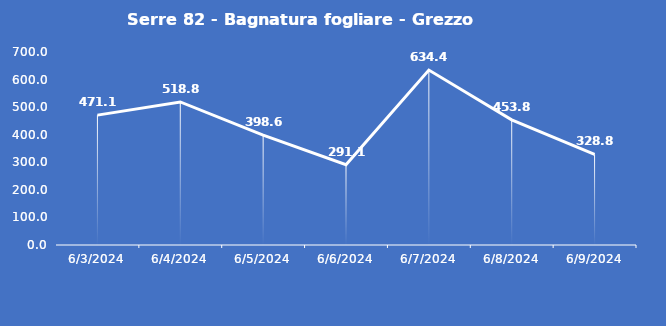
| Category | Serre 82 - Bagnatura fogliare - Grezzo (min) |
|---|---|
| 6/3/24 | 471.1 |
| 6/4/24 | 518.8 |
| 6/5/24 | 398.6 |
| 6/6/24 | 291.1 |
| 6/7/24 | 634.4 |
| 6/8/24 | 453.8 |
| 6/9/24 | 328.8 |